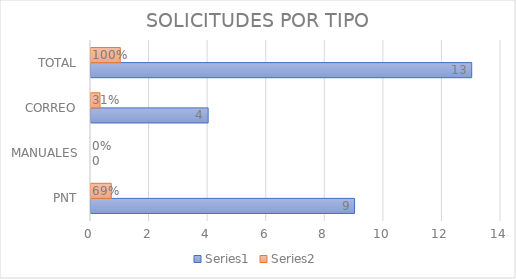
| Category | Series 0 | Series 1 |
|---|---|---|
| PNT | 9 | 0.692 |
| MANUALES | 0 | 0 |
| CORREO | 4 | 0.308 |
| TOTAL | 13 | 1 |